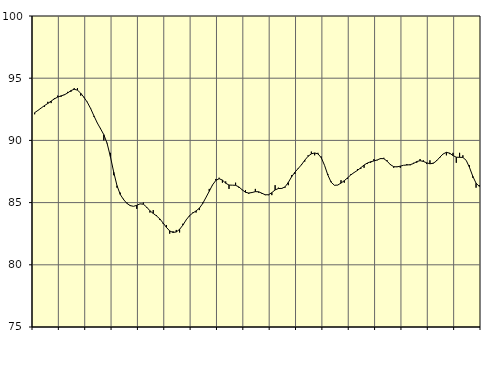
| Category | Piggar | Series 1 |
|---|---|---|
| nan | 92.1 | 92.23 |
| 87.0 | 92.4 | 92.41 |
| 87.0 | 92.6 | 92.61 |
| 87.0 | 92.7 | 92.8 |
| nan | 93.1 | 92.97 |
| 88.0 | 93 | 93.16 |
| 88.0 | 93.4 | 93.34 |
| 88.0 | 93.6 | 93.48 |
| nan | 93.5 | 93.58 |
| 89.0 | 93.7 | 93.66 |
| 89.0 | 93.9 | 93.81 |
| 89.0 | 93.9 | 94 |
| nan | 94.2 | 94.11 |
| 90.0 | 94.2 | 94.04 |
| 90.0 | 93.6 | 93.79 |
| 90.0 | 93.5 | 93.45 |
| nan | 93.1 | 93.06 |
| 91.0 | 92.6 | 92.56 |
| 91.0 | 91.9 | 91.97 |
| 91.0 | 91.4 | 91.41 |
| nan | 91 | 90.94 |
| 92.0 | 90 | 90.46 |
| 92.0 | 89.8 | 89.76 |
| 92.0 | 89 | 88.69 |
| nan | 87.2 | 87.45 |
| 93.0 | 86.2 | 86.36 |
| 93.0 | 85.8 | 85.65 |
| 93.0 | 85.3 | 85.24 |
| nan | 85 | 84.94 |
| 94.0 | 84.8 | 84.76 |
| 94.0 | 84.7 | 84.7 |
| 94.0 | 84.5 | 84.78 |
| nan | 84.9 | 84.9 |
| 95.0 | 85 | 84.87 |
| 95.0 | 84.6 | 84.64 |
| 95.0 | 84.2 | 84.34 |
| nan | 84.4 | 84.13 |
| 96.0 | 84 | 83.93 |
| 96.0 | 83.6 | 83.69 |
| 96.0 | 83.3 | 83.36 |
| nan | 83.2 | 83.01 |
| 97.0 | 82.5 | 82.72 |
| 97.0 | 82.7 | 82.6 |
| 97.0 | 82.8 | 82.64 |
| nan | 82.6 | 82.85 |
| 98.0 | 83.3 | 83.19 |
| 98.0 | 83.6 | 83.61 |
| 98.0 | 83.9 | 83.95 |
| nan | 84.2 | 84.16 |
| 99.0 | 84.2 | 84.33 |
| 99.0 | 84.4 | 84.55 |
| 99.0 | 85 | 84.92 |
| nan | 85.4 | 85.41 |
| 0.0 | 86.1 | 85.91 |
| 0.0 | 86.4 | 86.42 |
| 0.0 | 86.9 | 86.78 |
| nan | 87 | 86.92 |
| 1.0 | 86.6 | 86.81 |
| 1.0 | 86.7 | 86.56 |
| 1.0 | 86.1 | 86.41 |
| nan | 86.4 | 86.4 |
| 2.0 | 86.6 | 86.39 |
| 2.0 | 86.2 | 86.26 |
| 2.0 | 86 | 86.03 |
| nan | 86 | 85.83 |
| 3.0 | 85.7 | 85.77 |
| 3.0 | 85.8 | 85.81 |
| 3.0 | 86.1 | 85.88 |
| nan | 85.8 | 85.87 |
| 4.0 | 85.7 | 85.75 |
| 4.0 | 85.6 | 85.63 |
| 4.0 | 85.6 | 85.63 |
| nan | 85.6 | 85.8 |
| 5.0 | 86.4 | 86.02 |
| 5.0 | 86.2 | 86.13 |
| 5.0 | 86.1 | 86.14 |
| nan | 86.2 | 86.26 |
| 6.0 | 86.4 | 86.62 |
| 6.0 | 87.2 | 87.07 |
| 6.0 | 87.3 | 87.44 |
| nan | 87.7 | 87.74 |
| 7.0 | 88.1 | 88.04 |
| 7.0 | 88.3 | 88.41 |
| 7.0 | 88.8 | 88.72 |
| nan | 89.1 | 88.92 |
| 8.0 | 88.8 | 88.99 |
| 8.0 | 89 | 88.92 |
| 8.0 | 88.7 | 88.61 |
| nan | 88 | 88 |
| 9.0 | 87.3 | 87.22 |
| 9.0 | 86.7 | 86.64 |
| 9.0 | 86.4 | 86.39 |
| nan | 86.4 | 86.41 |
| 10.0 | 86.8 | 86.57 |
| 10.0 | 86.6 | 86.76 |
| 10.0 | 86.9 | 86.99 |
| nan | 87.3 | 87.23 |
| 11.0 | 87.4 | 87.42 |
| 11.0 | 87.7 | 87.59 |
| 11.0 | 87.7 | 87.8 |
| nan | 87.8 | 88.02 |
| 12.0 | 88.1 | 88.18 |
| 12.0 | 88.2 | 88.28 |
| 12.0 | 88.5 | 88.35 |
| nan | 88.4 | 88.43 |
| 13.0 | 88.5 | 88.54 |
| 13.0 | 88.6 | 88.53 |
| 13.0 | 88.4 | 88.33 |
| nan | 88.1 | 88.05 |
| 14.0 | 87.8 | 87.89 |
| 14.0 | 87.9 | 87.87 |
| 14.0 | 87.8 | 87.93 |
| nan | 88 | 88 |
| 15.0 | 88.1 | 88.02 |
| 15.0 | 88 | 88.05 |
| 15.0 | 88.2 | 88.14 |
| nan | 88.2 | 88.3 |
| 16.0 | 88.5 | 88.37 |
| 16.0 | 88.4 | 88.31 |
| 16.0 | 88.1 | 88.2 |
| nan | 88.4 | 88.12 |
| 17.0 | 88.2 | 88.16 |
| 17.0 | 88.4 | 88.35 |
| 17.0 | 88.6 | 88.65 |
| nan | 88.9 | 88.91 |
| 18.0 | 88.8 | 89.04 |
| 18.0 | 88.9 | 88.97 |
| 18.0 | 89 | 88.78 |
| nan | 88.2 | 88.65 |
| 19.0 | 89 | 88.64 |
| 19.0 | 88.8 | 88.63 |
| 19.0 | 88.4 | 88.4 |
| nan | 88 | 87.83 |
| 20.0 | 87 | 87.12 |
| 20.0 | 86.2 | 86.56 |
| 20.0 | 86.4 | 86.3 |